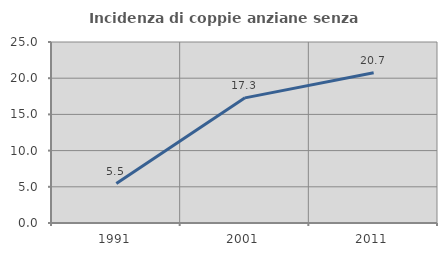
| Category | Incidenza di coppie anziane senza figli  |
|---|---|
| 1991.0 | 5.455 |
| 2001.0 | 17.284 |
| 2011.0 | 20.741 |